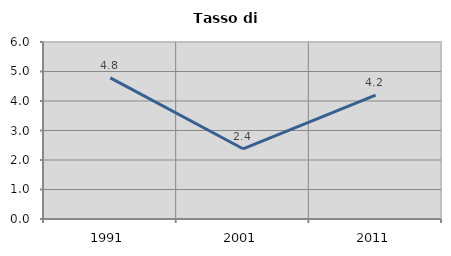
| Category | Tasso di disoccupazione   |
|---|---|
| 1991.0 | 4.782 |
| 2001.0 | 2.38 |
| 2011.0 | 4.2 |